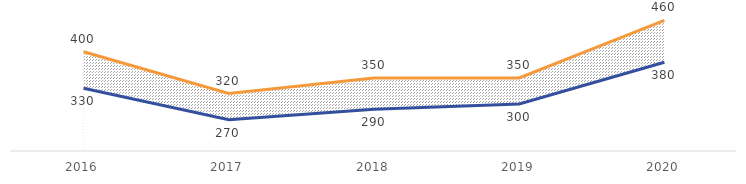
| Category | Hypothèse haute des attaques par rançongiciel | Hypothèse basse des attaques par rançongiciel |
|---|---|---|
| 2016.0 | 400 | 330 |
| 2017.0 | 320 | 270 |
| 2018.0 | 350 | 290 |
| 2019.0 | 350 | 300 |
| 2020.0 | 460 | 380 |